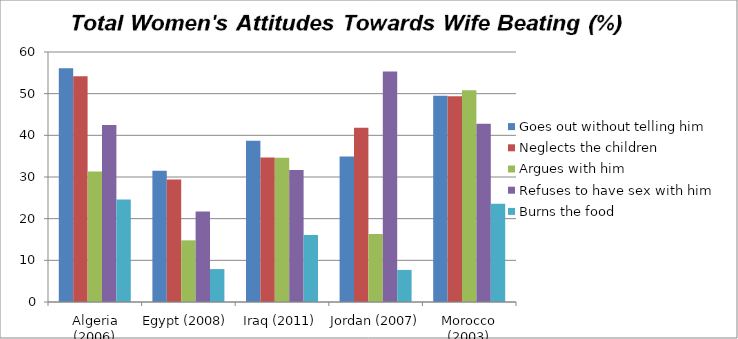
| Category | Goes out without telling him  | Neglects the children  | Argues with him  | Refuses to have sex with him  | Burns the food |
|---|---|---|---|---|---|
| Algeria (2006) | 56.1 | 54.2 | 31.3 | 42.5 | 24.6 |
| Egypt (2008) | 31.5 | 29.4 | 14.8 | 21.7 | 7.9 |
| Iraq (2011) | 38.7 | 34.7 | 34.6 | 31.7 | 16.1 |
| Jordan (2007) | 34.9 | 41.8 | 16.3 | 55.3 | 7.7 |
| Morocco (2003) | 49.5 | 49.4 | 50.8 | 42.8 | 23.6 |